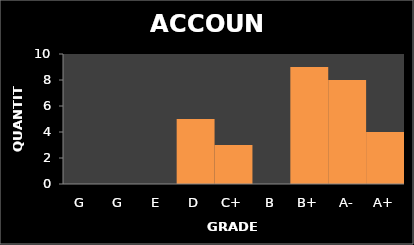
| Category | Quantity |
|---|---|
| G | 0 |
| G | 0 |
| E | 0 |
| D | 5 |
| C+ | 3 |
| B | 0 |
| B+ | 9 |
| A- | 8 |
| A+ | 4 |